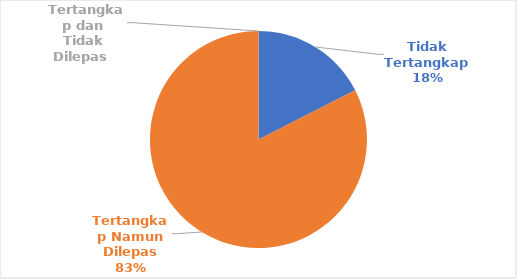
| Category | Indikator spesies ETP (endangered species, threatened species, and protected species) |
|---|---|
| Tidak Tertangkap  | 7 |
| Tertangkap Namun Dilepas | 33 |
|  Tertangkap dan Tidak Dilepas  | 0 |